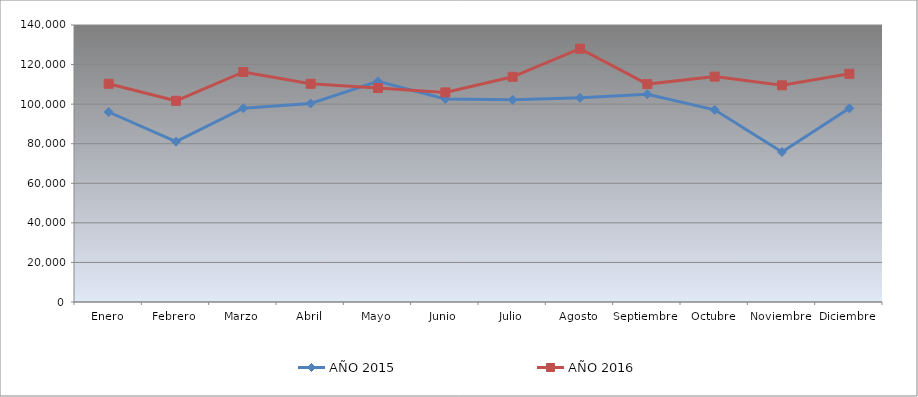
| Category | AÑO 2015 | AÑO 2016 |
|---|---|---|
| Enero | 96029.371 | 110284.744 |
| Febrero | 81024.625 | 101689.629 |
| Marzo | 97944.079 | 116251.489 |
| Abril | 100365.815 | 110281.485 |
| Mayo | 111540.642 | 108179.24 |
| Junio | 102620.551 | 105940.138 |
| Julio | 102161.5 | 113822.588 |
| Agosto | 103211.78 | 128008.579 |
| Septiembre | 105036.188 | 110127.285 |
| Octubre | 97120.063 | 113916.702 |
| Noviembre | 75814.429 | 109522.067 |
| Diciembre | 97881.357 | 115327.207 |